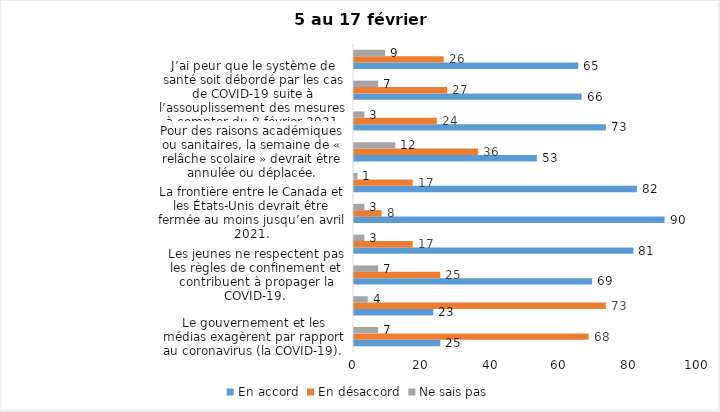
| Category | En accord | En désaccord | Ne sais pas |
|---|---|---|---|
| Le gouvernement et les médias exagèrent par rapport au coronavirus (la COVID-19). | 25 | 68 | 7 |
| Il est exagéré de rester chez soi pour se protéger contre le coronavirus (la COVID-19). | 23 | 73 | 4 |
| Les jeunes ne respectent pas les règles de confinement et contribuent à propager la COVID-19. | 69 | 25 | 7 |
| C’est une bonne chose que les policiers puissent donner facilement des contraventions aux gens qui ne respectent pas les mesures pour prévenir le coronavirus (la COVID-19). | 81 | 17 | 3 |
| La frontière entre le Canada et les États-Unis devrait être fermée au moins jusqu’en avril 2021. | 90 | 8 | 3 |
| Je suis favorable au port du masque ou du couvre-visage dans les
lieux publics extérieurs achalandés (ex. rues, parcs) | 82 | 17 | 1 |
| Pour des raisons académiques ou sanitaires, la semaine de « relâche scolaire » devrait être annulée ou déplacée. | 53 | 36 | 12 |
| C’est une bonne chose de rouvrir les services et commerces non essentiels (salons de coiffure, magasins, musée, industries) à partir du 8 février 2021. | 73 | 24 | 3 |
| J’ai peur que le système de santé soit débordé par les cas de COVID-19 suite à l’assouplissement des mesures à compter du 8 février 2021. | 66 | 27 | 7 |
| J’ai peur que la reprise des cours en présentiel dans les cégeps et les universités génère une augmentation des cas de COVID-19. | 65 | 26 | 9 |